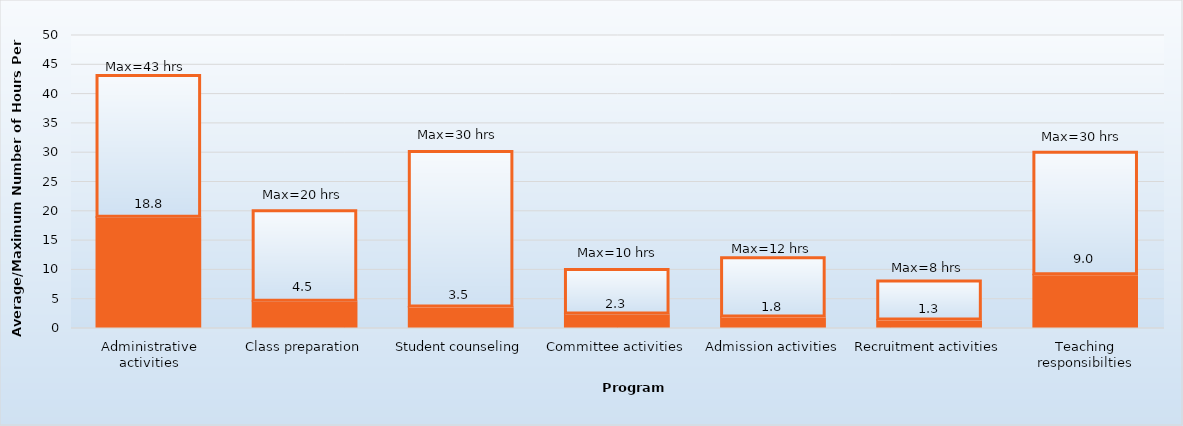
| Category | Average hours per week | Maximum |
|---|---|---|
| Administrative activities | 18.8 | 24.3 |
| Class preparation | 4.5 | 15.5 |
| Student counseling | 3.5 | 26.6 |
| Committee activities | 2.3 | 7.7 |
| Admission activities | 1.8 | 10.2 |
| Recruitment activities | 1.3 | 6.7 |
| Teaching responsibilties | 9 | 21 |